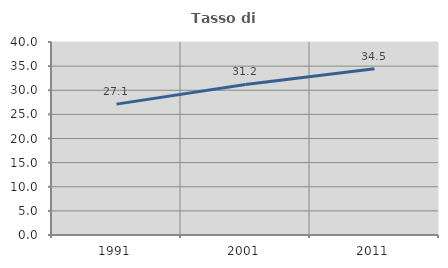
| Category | Tasso di occupazione   |
|---|---|
| 1991.0 | 27.123 |
| 2001.0 | 31.213 |
| 2011.0 | 34.478 |